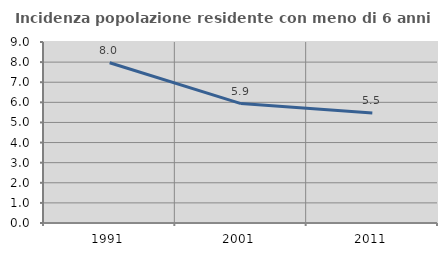
| Category | Incidenza popolazione residente con meno di 6 anni |
|---|---|
| 1991.0 | 7.969 |
| 2001.0 | 5.937 |
| 2011.0 | 5.476 |